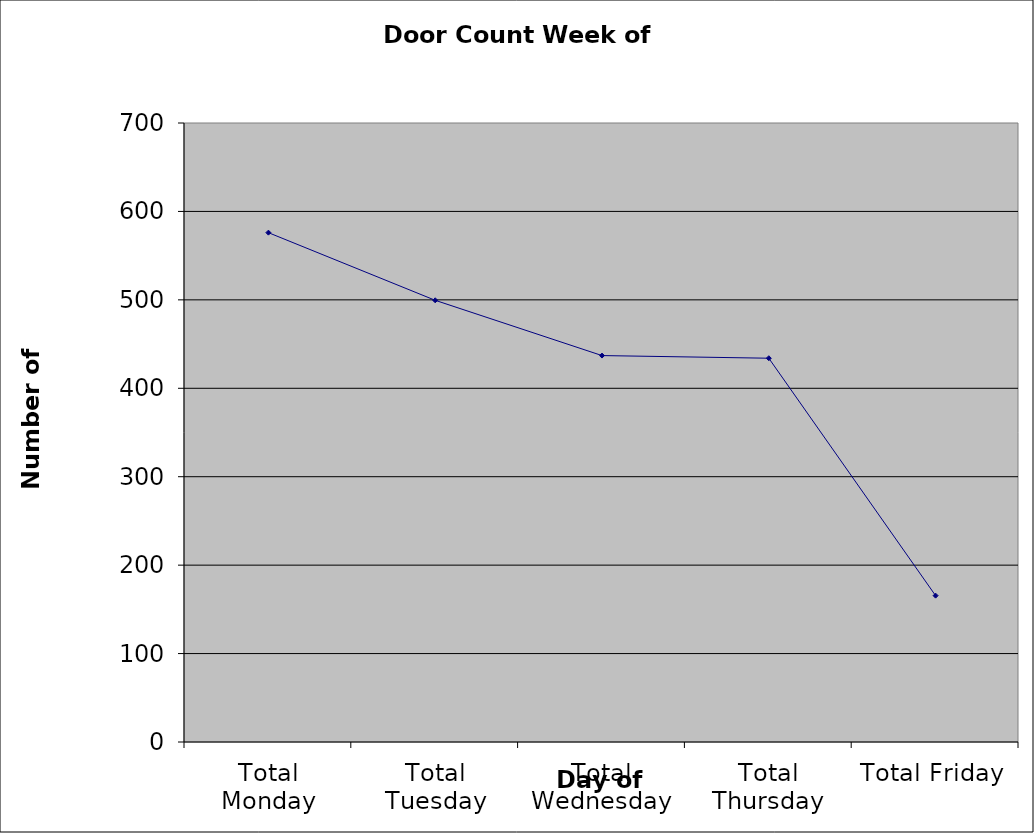
| Category | Series 0 |
|---|---|
| Total Monday | 576 |
| Total Tuesday | 499.5 |
| Total Wednesday | 437 |
| Total Thursday | 434 |
| Total Friday | 165.5 |